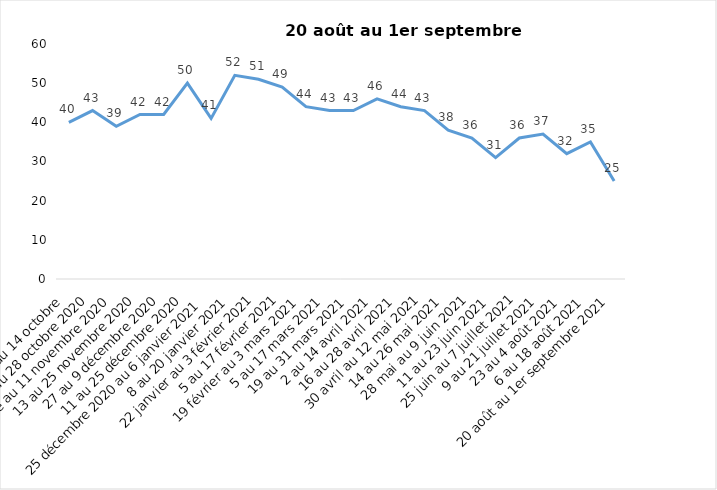
| Category | Toujours aux trois mesures |
|---|---|
| 2 au 14 octobre  | 40 |
| 16 au 28 octobre 2020 | 43 |
| 30 octobre au 11 novembre 2020 | 39 |
| 13 au 25 novembre 2020 | 42 |
| 27 au 9 décembre 2020 | 42 |
| 11 au 25 décembre 2020 | 50 |
| 25 décembre 2020 au 6 janvier 2021 | 41 |
| 8 au 20 janvier 2021 | 52 |
| 22 janvier au 3 février 2021 | 51 |
| 5 au 17 février 2021 | 49 |
| 19 février au 3 mars 2021 | 44 |
| 5 au 17 mars 2021 | 43 |
| 19 au 31 mars 2021 | 43 |
| 2 au 14 avril 2021 | 46 |
| 16 au 28 avril 2021 | 44 |
| 30 avril au 12 mai 2021 | 43 |
| 14 au 26 mai 2021 | 38 |
| 28 mai au 9 juin 2021 | 36 |
| 11 au 23 juin 2021 | 31 |
| 25 juin au 7 juillet 2021 | 36 |
| 9 au 21 juillet 2021 | 37 |
| 23 au 4 août 2021 | 32 |
| 6 au 18 août 2021 | 35 |
| 20 août au 1er septembre 2021 | 25 |